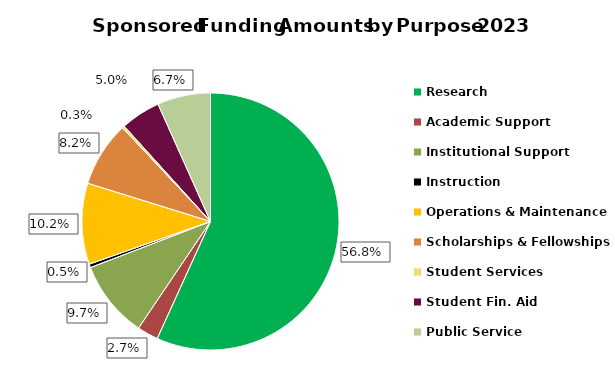
| Category | Series 0 |
|---|---|
| Research | 301329 |
| Academic Support | 14080 |
| Institutional Support | 51535 |
| Instruction | 2399 |
| Operations & Maintenance | 54025 |
| Scholarships & Fellowships | 43471 |
| Student Services | 1579 |
| Student Fin. Aid | 26600 |
| Public Service | 35523 |